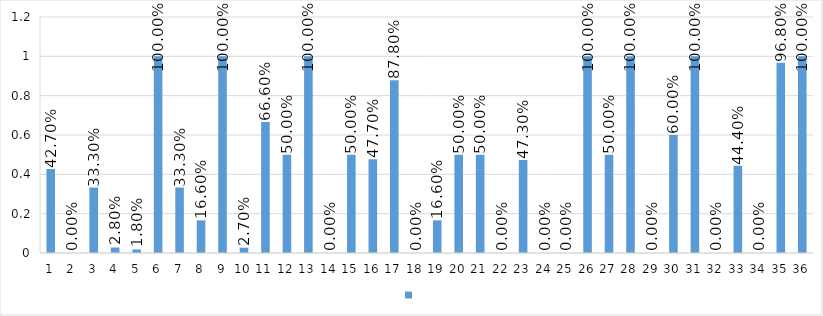
| Category | Series 0 |
|---|---|
| 1 | 0.427 |
| 2 | 0 |
| 3 | 0.333 |
| 4 | 0.028 |
| 5 | 0.018 |
| 6 | 1 |
| 7 | 0.333 |
| 8 | 0.166 |
| 9 | 1 |
| 10 | 0.027 |
| 11 | 0.666 |
| 12 | 0.5 |
| 13 | 1 |
| 14 | 0 |
| 15 | 0.5 |
| 16 | 0.477 |
| 17 | 0.878 |
| 18 | 0 |
| 19 | 0.166 |
| 20 | 0.5 |
| 21 | 0.5 |
| 22 | 0 |
| 23 | 0.473 |
| 24 | 0 |
| 25 | 0 |
| 26 | 1 |
| 27 | 0.5 |
| 28 | 1 |
| 29 | 0 |
| 30 | 0.6 |
| 31 | 1 |
| 32 | 0 |
| 33 | 0.444 |
| 34 | 0 |
| 35 | 0.968 |
| 36 | 1 |